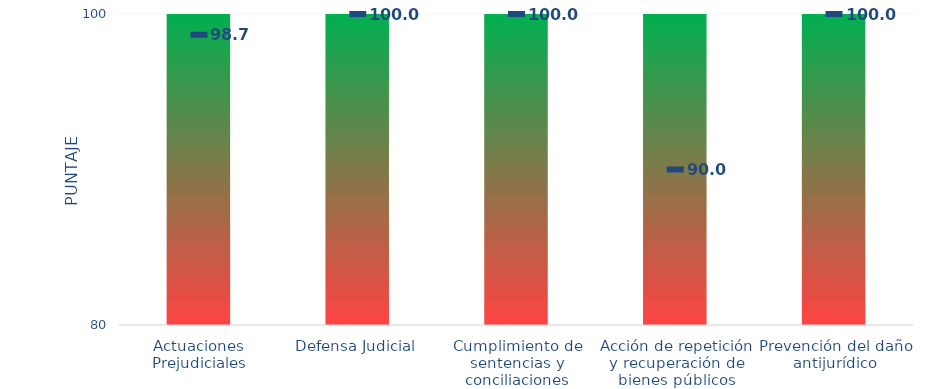
| Category | Rangos |
|---|---|
| Actuaciones Prejudiciales | 100 |
| Defensa Judicial | 100 |
| Cumplimiento de sentencias y conciliaciones | 100 |
| Acción de repetición y recuperación de bienes públicos | 100 |
| Prevención del daño antijurídico | 100 |